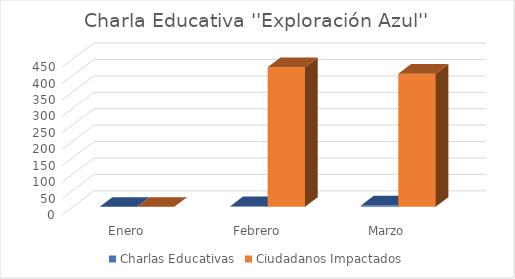
| Category | Charlas Educativas | Ciudadanos Impactados |
|---|---|---|
| Enero | 0 | 0 |
| Febrero | 2 | 425 |
| Marzo | 4 | 405 |